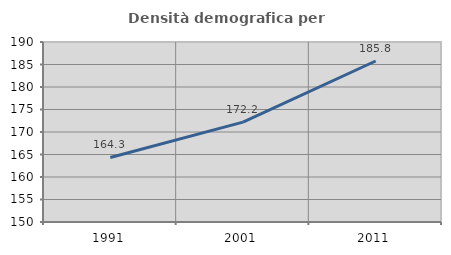
| Category | Densità demografica |
|---|---|
| 1991.0 | 164.34 |
| 2001.0 | 172.191 |
| 2011.0 | 185.776 |